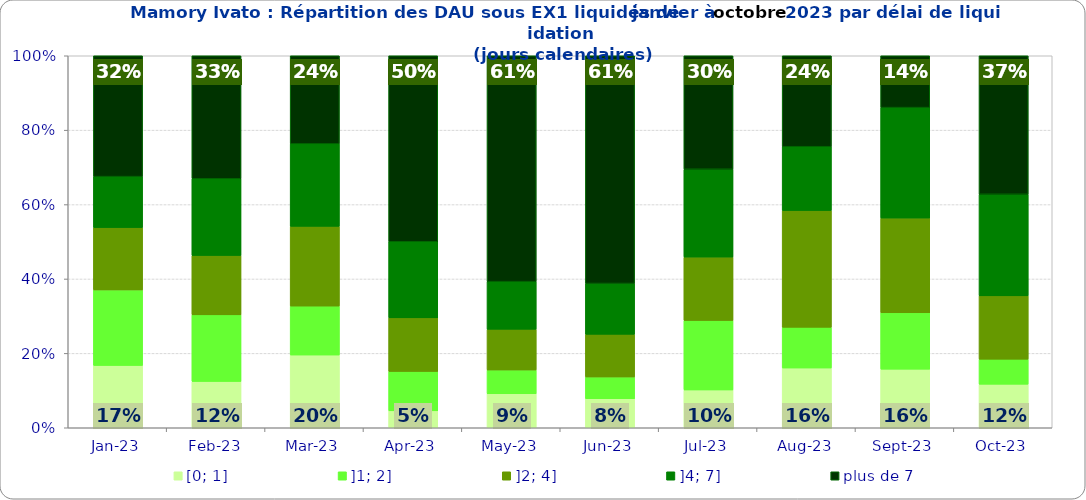
| Category | [0; 1] | ]1; 2] | ]2; 4] | ]4; 7] | plus de 7 |
|---|---|---|---|---|---|
| 2023-01-01 | 0.168 | 0.203 | 0.168 | 0.137 | 0.325 |
| 2023-02-01 | 0.125 | 0.179 | 0.16 | 0.206 | 0.331 |
| 2023-03-01 | 0.195 | 0.132 | 0.214 | 0.222 | 0.237 |
| 2023-04-01 | 0.045 | 0.106 | 0.144 | 0.205 | 0.5 |
| 2023-05-01 | 0.091 | 0.064 | 0.11 | 0.128 | 0.607 |
| 2023-06-01 | 0.078 | 0.059 | 0.115 | 0.137 | 0.612 |
| 2023-07-01 | 0.102 | 0.187 | 0.17 | 0.236 | 0.305 |
| 2023-08-01 | 0.161 | 0.109 | 0.314 | 0.172 | 0.245 |
| 2023-09-01 | 0.158 | 0.152 | 0.255 | 0.297 | 0.139 |
| 2023-10-01 | 0.117 | 0.067 | 0.17 | 0.273 | 0.372 |